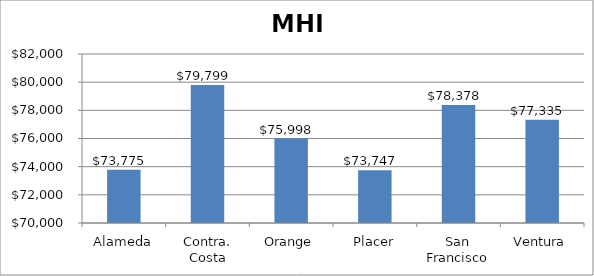
| Category | Series 0 |
|---|---|
| Alameda | 73775 |
| Contra. Costa | 79799 |
| Orange | 75998 |
| Placer | 73747 |
| San Francisco | 78378 |
| Ventura | 77335 |